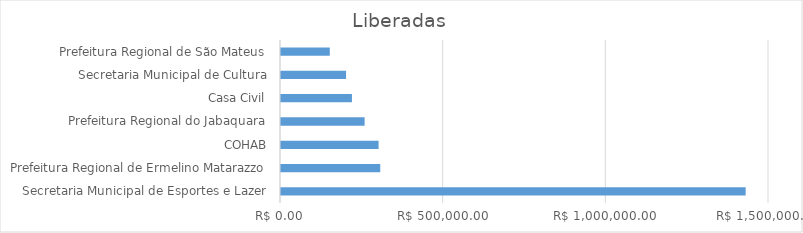
| Category | Series 0 |
|---|---|
| Secretaria Municipal de Esportes e Lazer | 1428242.9 |
| Prefeitura Regional de Ermelino Matarazzo | 305000 |
| COHAB | 300000 |
| Prefeitura Regional do Jabaquara | 257000 |
| Casa Civil | 218097.4 |
| Secretaria Municipal de Cultura | 200000 |
| Prefeitura Regional de São Mateus | 150000 |